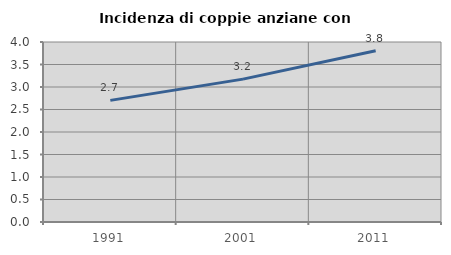
| Category | Incidenza di coppie anziane con figli |
|---|---|
| 1991.0 | 2.703 |
| 2001.0 | 3.175 |
| 2011.0 | 3.804 |